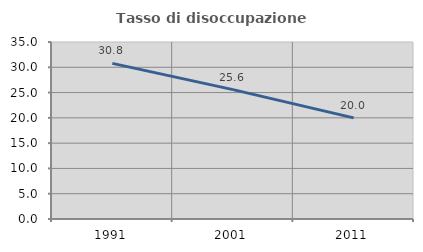
| Category | Tasso di disoccupazione giovanile  |
|---|---|
| 1991.0 | 30.769 |
| 2001.0 | 25.581 |
| 2011.0 | 20 |